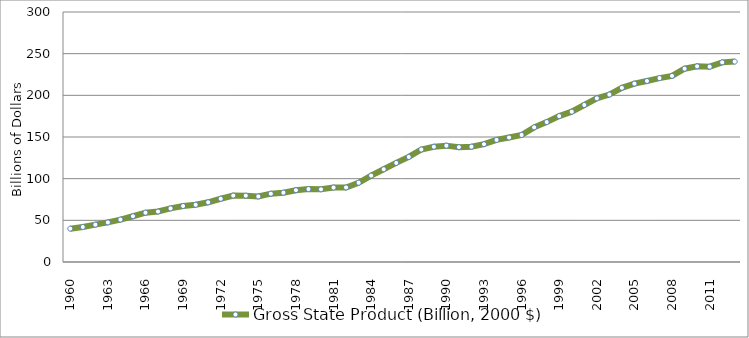
| Category | Gross State Product (Billion, 2000 $) |
|---|---|
| 1960.0 | 39.977 |
| 1961.0 | 42.016 |
| 1962.0 | 44.818 |
| 1963.0 | 47.482 |
| 1964.0 | 50.919 |
| 1965.0 | 54.927 |
| 1966.0 | 59.12 |
| 1967.0 | 60.573 |
| 1968.0 | 64.286 |
| 1969.0 | 67.167 |
| 1970.0 | 68.666 |
| 1971.0 | 71.628 |
| 1972.0 | 75.893 |
| 1973.0 | 79.698 |
| 1974.0 | 79.63 |
| 1975.0 | 78.682 |
| 1976.0 | 81.993 |
| 1977.0 | 83.202 |
| 1978.0 | 86.159 |
| 1979.0 | 87.496 |
| 1980.0 | 87.221 |
| 1981.0 | 89.375 |
| 1982.0 | 89.448 |
| 1983.0 | 95.101 |
| 1984.0 | 103.7 |
| 1985.0 | 111.31 |
| 1986.0 | 118.881 |
| 1987.0 | 126.066 |
| 1988.0 | 135.014 |
| 1989.0 | 138.317 |
| 1990.0 | 139.627 |
| 1991.0 | 137.815 |
| 1992.0 | 138.362 |
| 1993.0 | 141.367 |
| 1994.0 | 146.56 |
| 1995.0 | 149.373 |
| 1996.0 | 152.471 |
| 1997.0 | 161.598 |
| 1998.0 | 167.893 |
| 1999.0 | 175.084 |
| 2000.0 | 180.367 |
| 2001.0 | 188.402 |
| 2002.0 | 196.429 |
| 2003.0 | 200.945 |
| 2004.0 | 209.066 |
| 2005.0 | 214.048 |
| 2006.0 | 217.2 |
| 2007.0 | 220.692 |
| 2008.0 | 223.354 |
| 2009.0 | 231.936 |
| 2010.0 | 234.8 |
| 2011.0 | 234.363 |
| 2012.0 | 239.548 |
| 2013.0 | 240.473 |